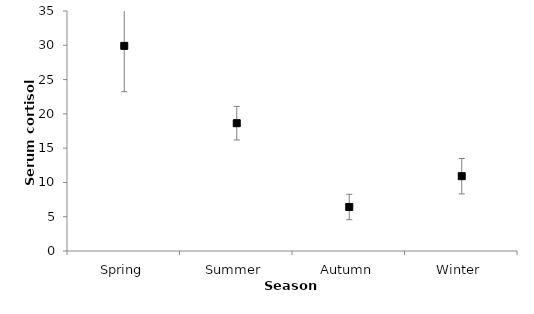
| Category | Series 0 |
|---|---|
| Spring | 29.916 |
| Summer | 18.639 |
| Autumn | 6.419 |
| Winter | 10.911 |